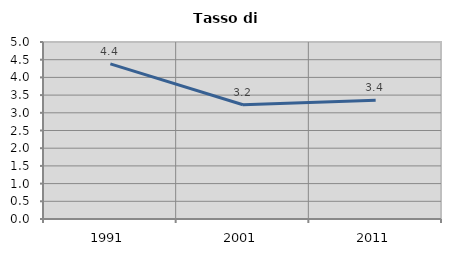
| Category | Tasso di disoccupazione   |
|---|---|
| 1991.0 | 4.383 |
| 2001.0 | 3.226 |
| 2011.0 | 3.358 |